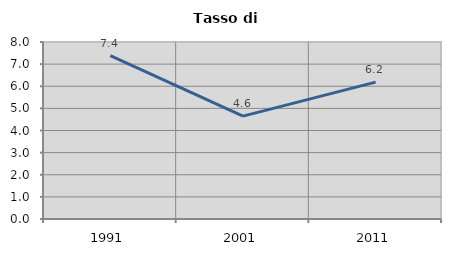
| Category | Tasso di disoccupazione   |
|---|---|
| 1991.0 | 7.384 |
| 2001.0 | 4.65 |
| 2011.0 | 6.186 |